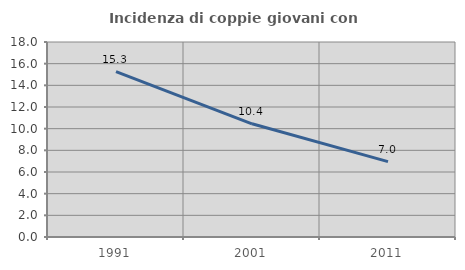
| Category | Incidenza di coppie giovani con figli |
|---|---|
| 1991.0 | 15.268 |
| 2001.0 | 10.448 |
| 2011.0 | 6.962 |